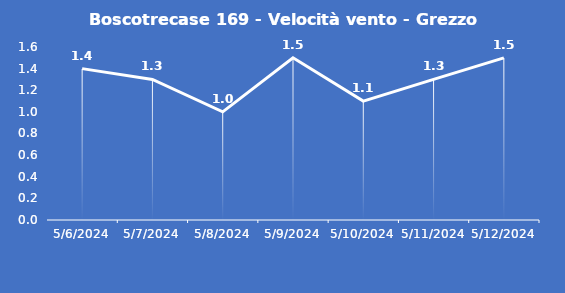
| Category | Boscotrecase 169 - Velocità vento - Grezzo (m/s) |
|---|---|
| 5/6/24 | 1.4 |
| 5/7/24 | 1.3 |
| 5/8/24 | 1 |
| 5/9/24 | 1.5 |
| 5/10/24 | 1.1 |
| 5/11/24 | 1.3 |
| 5/12/24 | 1.5 |